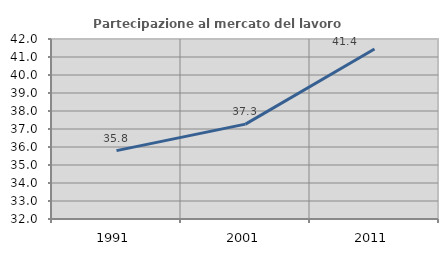
| Category | Partecipazione al mercato del lavoro  femminile |
|---|---|
| 1991.0 | 35.799 |
| 2001.0 | 37.269 |
| 2011.0 | 41.447 |